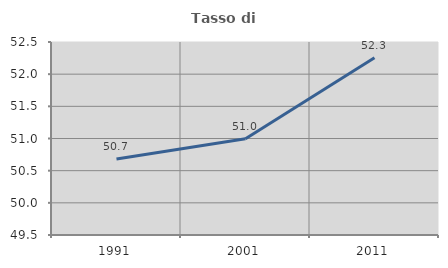
| Category | Tasso di occupazione   |
|---|---|
| 1991.0 | 50.682 |
| 2001.0 | 50.995 |
| 2011.0 | 52.254 |